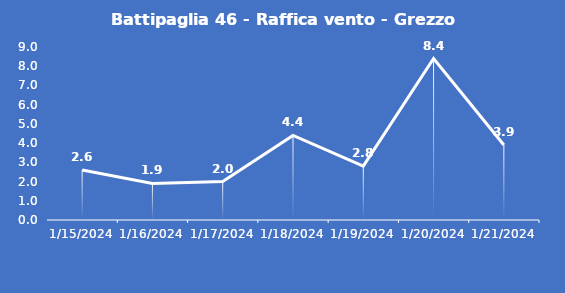
| Category | Battipaglia 46 - Raffica vento - Grezzo (m/s) |
|---|---|
| 1/15/24 | 2.6 |
| 1/16/24 | 1.9 |
| 1/17/24 | 2 |
| 1/18/24 | 4.4 |
| 1/19/24 | 2.8 |
| 1/20/24 | 8.4 |
| 1/21/24 | 3.9 |